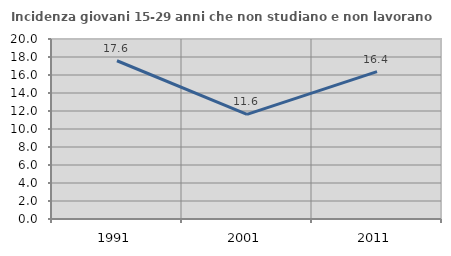
| Category | Incidenza giovani 15-29 anni che non studiano e non lavorano  |
|---|---|
| 1991.0 | 17.582 |
| 2001.0 | 11.623 |
| 2011.0 | 16.368 |